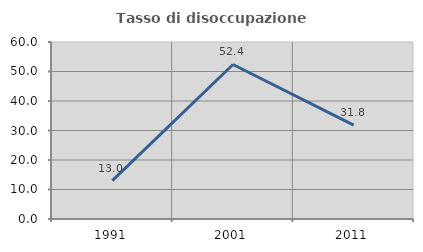
| Category | Tasso di disoccupazione giovanile  |
|---|---|
| 1991.0 | 12.987 |
| 2001.0 | 52.381 |
| 2011.0 | 31.818 |